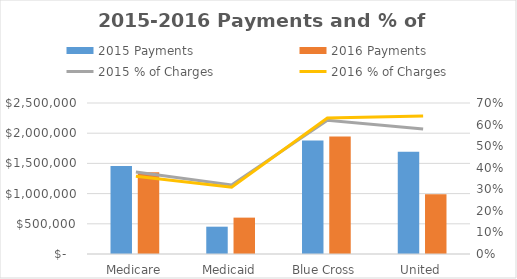
| Category | 2015 Payments | 2016 Payments |
|---|---|---|
| Medicare | 1456280 | 1355209 |
| Medicaid | 452337 | 602151 |
| Blue Cross | 1880032 | 1945283 |
| United | 1692232 | 990218 |